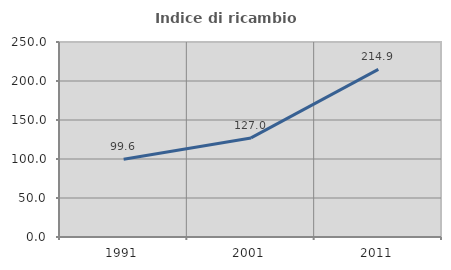
| Category | Indice di ricambio occupazionale  |
|---|---|
| 1991.0 | 99.617 |
| 2001.0 | 127.027 |
| 2011.0 | 214.918 |